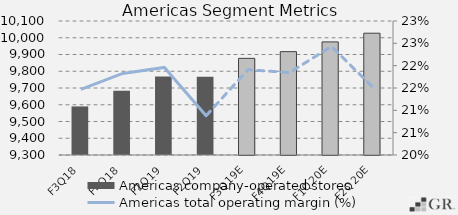
| Category | Americas company-operated stores |
|---|---|
|  F3Q18  | 9590 |
|  F4Q18  | 9684 |
|  F1Q19  | 9768 |
|  F2Q19  | 9767 |
|  F3Q19E  | 9877 |
|  F4Q19E  | 9917 |
|  F1Q20E  | 9975.276 |
|  F2Q20E  | 10027.122 |